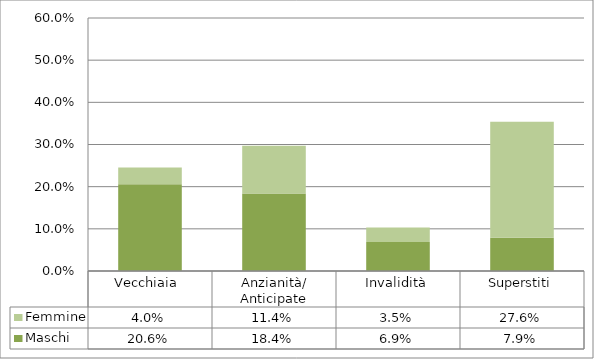
| Category | Maschi | Femmine |
|---|---|---|
| Vecchiaia  | 0.206 | 0.04 |
| Anzianità/ Anticipate | 0.184 | 0.114 |
| Invalidità | 0.069 | 0.035 |
| Superstiti | 0.079 | 0.276 |